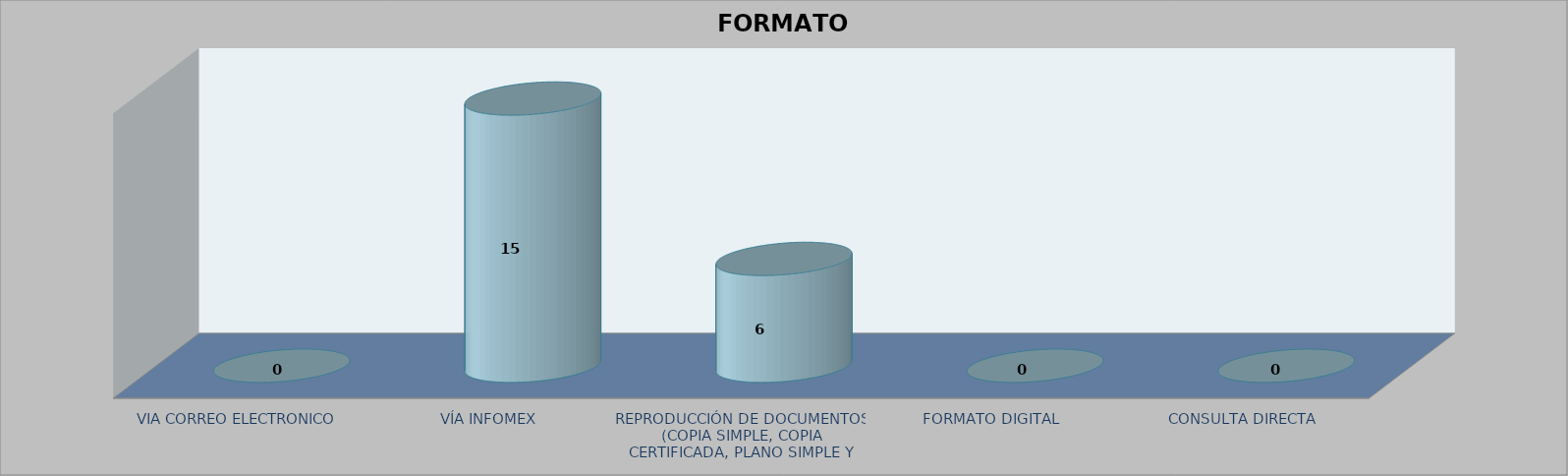
| Category |        FORMATO SOLICITADO | Series 1 | Series 2 |
|---|---|---|---|
| VIA CORREO ELECTRONICO |  |  | 0 |
| VÍA INFOMEX |  |  | 15 |
| REPRODUCCIÓN DE DOCUMENTOS (COPIA SIMPLE, COPIA CERTIFICADA, PLANO SIMPLE Y PLANO CERTIFICADO) |  |  | 6 |
| FORMATO DIGITAL |  |  | 0 |
| CONSULTA DIRECTA |  |  | 0 |